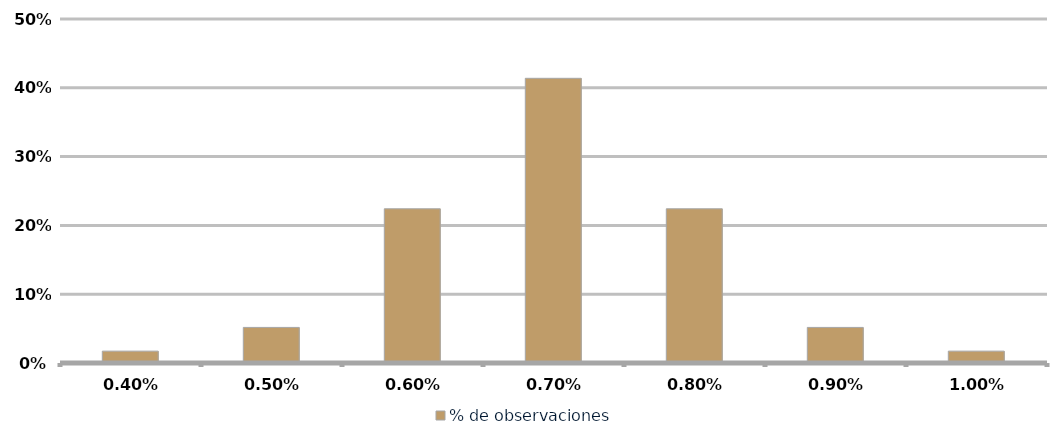
| Category | % de observaciones  |
|---|---|
| 0.004 | 0.017 |
| 0.005 | 0.052 |
| 0.006 | 0.224 |
| 0.007 | 0.414 |
| 0.008 | 0.224 |
| 0.009000000000000001 | 0.052 |
| 0.010000000000000002 | 0.017 |